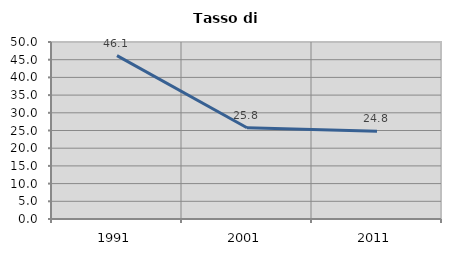
| Category | Tasso di disoccupazione   |
|---|---|
| 1991.0 | 46.137 |
| 2001.0 | 25.78 |
| 2011.0 | 24.819 |